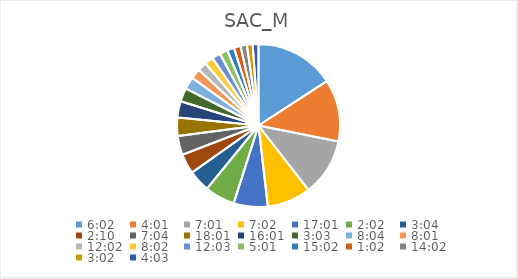
| Category | Series 0 |
|---|---|
| 0.2513888888888889 | 16.986 |
| 0.1673611111111111 | 13.205 |
| 0.2923611111111111 | 12.202 |
| 0.29305555555555557 | 9.296 |
| 0.7090277777777777 | 7.231 |
| 0.08472222222222221 | 6.399 |
| 0.1277777777777778 | 4.641 |
| 0.09027777777777778 | 4.243 |
| 0.29444444444444445 | 4.046 |
| 0.7506944444444444 | 3.914 |
| 0.6673611111111111 | 3.457 |
| 0.12708333333333333 | 2.875 |
| 0.3361111111111111 | 2.618 |
| 0.3340277777777778 | 2.173 |
| 0.5013888888888889 | 1.92 |
| 0.3347222222222222 | 1.856 |
| 0.5020833333333333 | 1.793 |
| 0.20902777777777778 | 1.731 |
| 0.6263888888888889 | 1.48 |
| 0.04305555555555556 | 1.417 |
| 0.5847222222222223 | 1.355 |
| 0.12638888888888888 | 1.23 |
| 0.16874999999999998 | 1.23 |